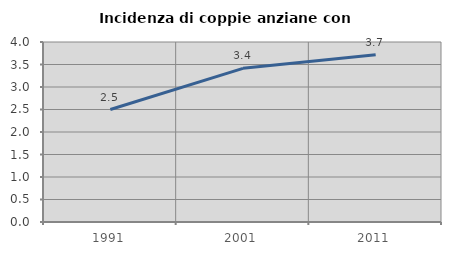
| Category | Incidenza di coppie anziane con figli |
|---|---|
| 1991.0 | 2.5 |
| 2001.0 | 3.414 |
| 2011.0 | 3.717 |